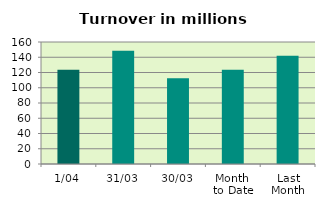
| Category | Series 0 |
|---|---|
| 1/04 | 123.609 |
| 31/03 | 148.61 |
| 30/03 | 112.34 |
| Month 
to Date | 123.609 |
| Last
Month | 142.086 |